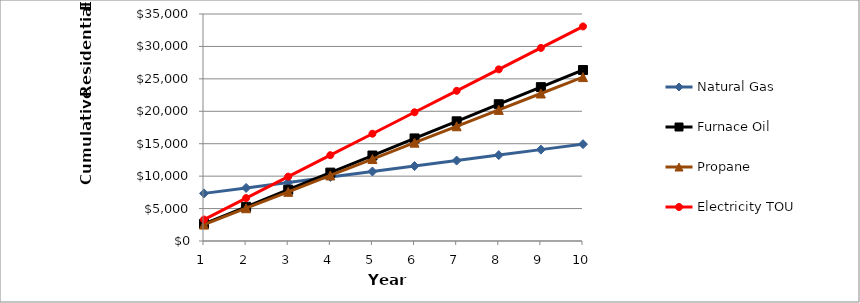
| Category | Natural Gas | Furnace Oil | Propane | Electricity TOU |
|---|---|---|---|---|
| 0 | 7343 | 2636 | 2527 | 3308 |
| 1 | 8186 | 5272 | 5054 | 6616 |
| 2 | 9029 | 7908 | 7581 | 9924 |
| 3 | 9872 | 10544 | 10108 | 13232 |
| 4 | 10715 | 13180 | 12635 | 16540 |
| 5 | 11558 | 15816 | 15162 | 19848 |
| 6 | 12401 | 18452 | 17689 | 23156 |
| 7 | 13244 | 21088 | 20216 | 26464 |
| 8 | 14087 | 23724 | 22743 | 29772 |
| 9 | 14930 | 26360 | 25270 | 33080 |